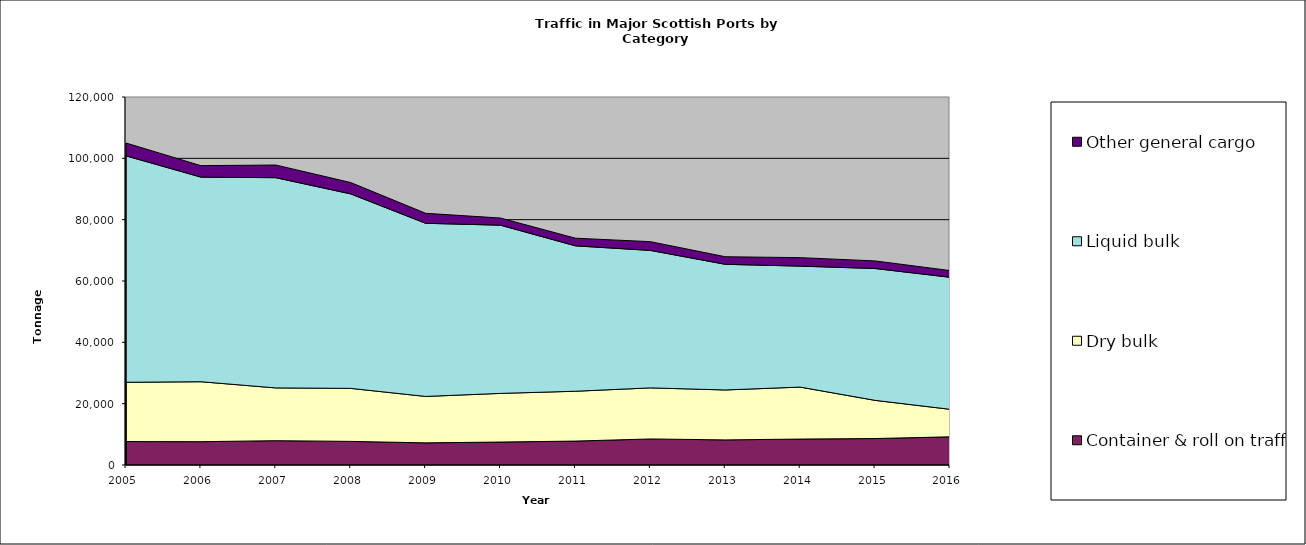
| Category | Container & roll on traffic | Dry bulk | Liquid bulk | Other general cargo |
|---|---|---|---|---|
| 2005.0 | 7639 | 19339 | 73828 | 4190 |
| 2006.0 | 7604 | 19548 | 66724 | 3744 |
| 2007.0 | 7932 | 17207 | 68553 | 4121 |
| 2008.0 | 7700 | 17283 | 63416 | 3709 |
| 2009.0 | 7217 | 15140 | 56462 | 3262 |
| 2010.0 | 7487 | 15862 | 54848 | 2332 |
| 2011.0 | 7799 | 16253 | 47410 | 2489 |
| 2012.0 | 8494 | 16651 | 44829 | 2859 |
| 2013.0 | 8186 | 16283 | 40973 | 2475 |
| 2014.0 | 8456 | 16944 | 39455 | 2761 |
| 2015.0 | 8630.139 | 12446 | 42993 | 2483 |
| 2016.0 | 9191 | 8973 | 43058 | 2187 |